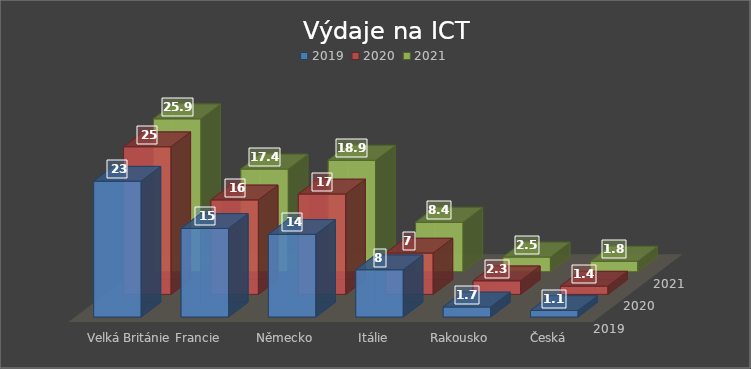
| Category | 2019 | 2020 | 2021 |
|---|---|---|---|
| Velká Británie | 23 | 25 | 25.9 |
| Francie | 15 | 16 | 17.4 |
| Německo | 14 | 17 | 18.9 |
| Itálie | 8 | 7 | 8.4 |
| Rakousko | 1.7 | 2.3 | 2.5 |
| Česká republika | 1.1 | 1.4 | 1.8 |